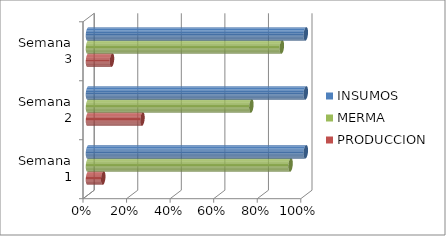
| Category | PRODUCCION | MERMA | INSUMOS |
|---|---|---|---|
| Semana 1 | 0.07 | 0.93 | 1 |
| Semana 2 | 0.25 | 0.75 | 1 |
| Semana 3 | 0.11 | 0.89 | 1 |